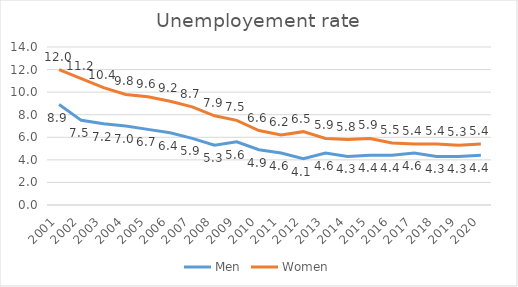
| Category | Men | Women |
|---|---|---|
| 2001.0 | 8.9 | 12 |
| 2002.0 | 7.5 | 11.2 |
| 2003.0 | 7.2 | 10.4 |
| 2004.0 | 7 | 9.8 |
| 2005.0 | 6.7 | 9.6 |
| 2006.0 | 6.4 | 9.2 |
| 2007.0 | 5.9 | 8.7 |
| 2008.0 | 5.3 | 7.9 |
| 2009.0 | 5.6 | 7.5 |
| 2010.0 | 4.9 | 6.6 |
| 2011.0 | 4.6 | 6.2 |
| 2012.0 | 4.1 | 6.5 |
| 2013.0 | 4.6 | 5.9 |
| 2014.0 | 4.3 | 5.8 |
| 2015.0 | 4.4 | 5.9 |
| 2016.0 | 4.4 | 5.5 |
| 2017.0 | 4.6 | 5.4 |
| 2018.0 | 4.3 | 5.4 |
| 2019.0 | 4.3 | 5.3 |
| 2020.0 | 4.4 | 5.4 |